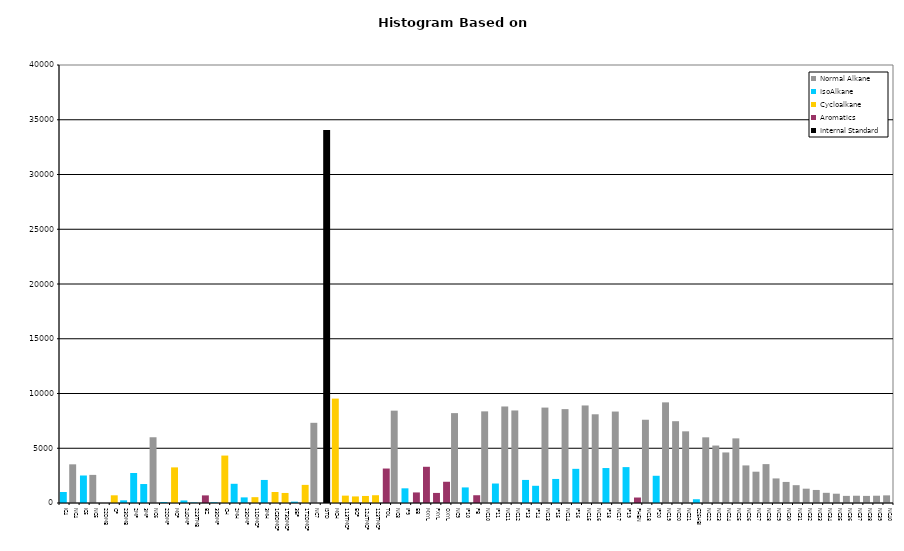
| Category | Normal Alkane | IsoAlkane | Cycloalkane | Aromatics | Internal Standard |
|---|---|---|---|---|---|
| IC4 | 0 | 1003 | 0 | 0 | 0 |
| NC4 | 3532 | 0 | 0 | 0 | 0 |
| IC5 | 0 | 2512 | 0 | 0 | 0 |
| NC5 | 2567 | 0 | 0 | 0 | 0 |
| 22DMB | 0 | 0 | 0 | 0 | 0 |
| CP | 0 | 0 | 703 | 0 | 0 |
| 23DMB | 0 | 246 | 0 | 0 | 0 |
| 2MP | 0 | 2742 | 0 | 0 | 0 |
| 3MP | 0 | 1732 | 0 | 0 | 0 |
| NC6 | 6004 | 0 | 0 | 0 | 0 |
| 22DMP | 0 | 92 | 0 | 0 | 0 |
| MCP | 0 | 0 | 3253 | 0 | 0 |
| 24DMP | 0 | 234 | 0 | 0 | 0 |
| 223TMB | 0 | 49 | 0 | 0 | 0 |
| BZ | 0 | 0 | 0 | 696 | 0 |
| 33DMP | 0 | 65 | 0 | 0 | 0 |
| CH | 0 | 0 | 4332 | 0 | 0 |
| 2MH | 0 | 1754 | 0 | 0 | 0 |
| 23DMP | 0 | 513 | 0 | 0 | 0 |
| 11DMCP | 0 | 0 | 533 | 0 | 0 |
| 3MH | 0 | 2105 | 0 | 0 | 0 |
| 1C3DMCP | 0 | 0 | 1006 | 0 | 0 |
| 1T3DMCP | 0 | 0 | 917 | 0 | 0 |
| 3EP | 0 | 125 | 0 | 0 | 0 |
| 1T2DMCP | 0 | 0 | 1654 | 0 | 0 |
| NC7 | 7323 | 0 | 0 | 0 | 0 |
| ISTD | 0 | 0 | 0 | 0 | 34074 |
| MCH | 0 | 0 | 9534 | 0 | 0 |
| 113TMCP | 0 | 0 | 673 | 0 | 0 |
| ECP | 0 | 0 | 601 | 0 | 0 |
| 124TMCP | 0 | 0 | 643 | 0 | 0 |
| 123TMCP | 0 | 0 | 710 | 0 | 0 |
| TOL | 0 | 0 | 0 | 3148 | 0 |
| NC8 | 8434 | 0 | 0 | 0 | 0 |
| IP9 | 0 | 1340 | 0 | 0 | 0 |
| EB | 0 | 0 | 0 | 965 | 0 |
| MXYL | 0 | 0 | 0 | 3308 | 0 |
| PXYL | 0 | 0 | 0 | 920 | 0 |
| OXYL | 0 | 0 | 0 | 1940 | 0 |
| NC9 | 8209 | 0 | 0 | 0 | 0 |
| IP10 | 0 | 1423 | 0 | 0 | 0 |
| PB | 0 | 0 | 0 | 709 | 0 |
| NC10 | 8369 | 0 | 0 | 0 | 0 |
| IP11 | 0 | 1779 | 0 | 0 | 0 |
| NC11 | 8815 | 0 | 0 | 0 | 0 |
| NC12 | 8451 | 0 | 0 | 0 | 0 |
| IP13 | 0 | 2107 | 0 | 0 | 0 |
| IP14 | 0 | 1572 | 0 | 0 | 0 |
| NC13 | 8714 | 0 | 0 | 0 | 0 |
| IP15 | 0 | 2196 | 0 | 0 | 0 |
| NC14 | 8573 | 0 | 0 | 0 | 0 |
| IP16 | 0 | 3120 | 0 | 0 | 0 |
| NC15 | 8908 | 0 | 0 | 0 | 0 |
| NC16 | 8102 | 0 | 0 | 0 | 0 |
| IP18 | 0 | 3193 | 0 | 0 | 0 |
| NC17 | 8352 | 0 | 0 | 0 | 0 |
| IP19 | 0 | 3278 | 0 | 0 | 0 |
| PHEN | 0 | 0 | 0 | 500 | 0 |
| NC18 | 7603 | 0 | 0 | 0 | 0 |
| IP20 | 0 | 2486 | 0 | 0 | 0 |
| NC19 | 9191 | 0 | 0 | 0 | 0 |
| NC20 | 7470 | 0 | 0 | 0 | 0 |
| NC21 | 6545 | 0 | 0 | 0 | 0 |
| C25HBI | 0 | 344 | 0 | 0 | 0 |
| NC22 | 5998 | 0 | 0 | 0 | 0 |
| NC23 | 5247 | 0 | 0 | 0 | 0 |
| NC24 | 4617 | 0 | 0 | 0 | 0 |
| NC25 | 5902 | 0 | 0 | 0 | 0 |
| NC26 | 3432 | 0 | 0 | 0 | 0 |
| NC27 | 2859 | 0 | 0 | 0 | 0 |
| NC28 | 3551 | 0 | 0 | 0 | 0 |
| NC29 | 2244 | 0 | 0 | 0 | 0 |
| NC30 | 1924 | 0 | 0 | 0 | 0 |
| NC31 | 1628 | 0 | 0 | 0 | 0 |
| NC32 | 1308 | 0 | 0 | 0 | 0 |
| NC33 | 1191 | 0 | 0 | 0 | 0 |
| NC34 | 930 | 0 | 0 | 0 | 0 |
| NC35 | 849 | 0 | 0 | 0 | 0 |
| NC36 | 650 | 0 | 0 | 0 | 0 |
| NC37 | 664 | 0 | 0 | 0 | 0 |
| NC38 | 648 | 0 | 0 | 0 | 0 |
| NC39 | 665 | 0 | 0 | 0 | 0 |
| NC40 | 698 | 0 | 0 | 0 | 0 |